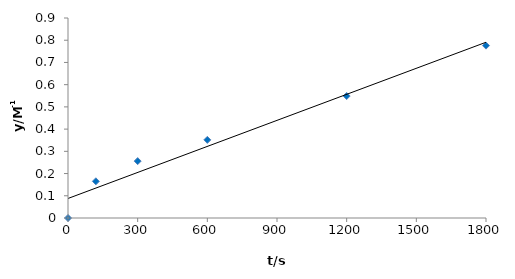
| Category | Series 0 |
|---|---|
| 0.0 | 0 |
| 120.0 | 0.165 |
| 300.0 | 0.256 |
| 600.0 | 0.352 |
| 1200.0 | 0.549 |
| 1800.0 | 0.776 |